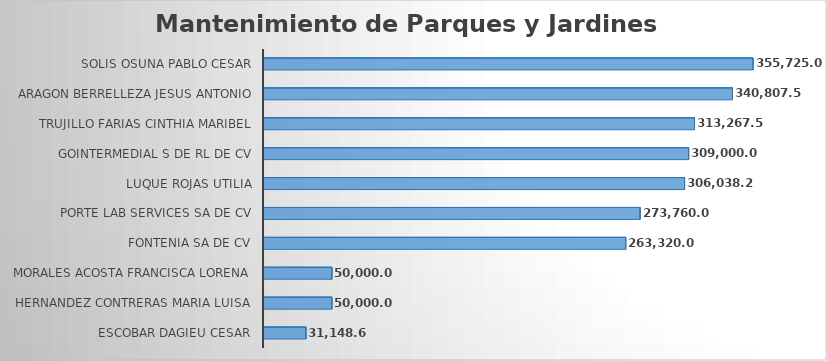
| Category | Suma  |
|---|---|
| ESCOBAR DAGIEU CESAR | 31148.67 |
| HERNANDEZ CONTRERAS MARIA LUISA | 50000 |
| MORALES ACOSTA FRANCISCA LORENA | 50000 |
| FONTENIA SA DE CV | 263320 |
| PORTE LAB SERVICES SA DE CV | 273760 |
| LUQUE ROJAS UTILIA | 306038.25 |
| GOINTERMEDIAL S DE RL DE CV | 309000 |
| TRUJILLO FARIAS CINTHIA MARIBEL | 313267.5 |
| ARAGON BERRELLEZA JESUS ANTONIO | 340807.5 |
| SOLIS OSUNA PABLO CESAR | 355725 |